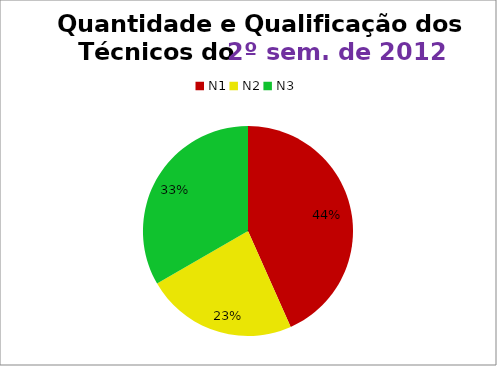
| Category | 2º/12 |
|---|---|
| N1 | 13 |
| N2 | 7 |
| N3 | 10 |